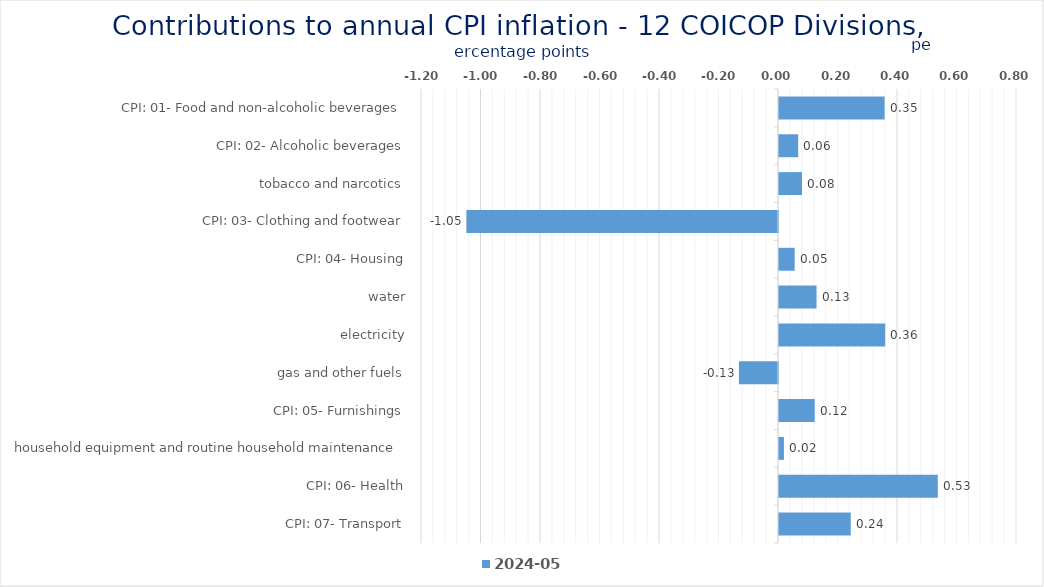
| Category | 2024-05 |
|---|---|
| CPI: 01- Food and non-alcoholic beverages | 0.355 |
| CPI: 02- Alcoholic beverages, tobacco and narcotics | 0.064 |
| CPI: 03- Clothing and footwear | 0.077 |
| CPI: 04- Housing, water, electricity, gas and other fuels | -1.047 |
| CPI: 05- Furnishings, household equipment and routine household maintenance | 0.053 |
| CPI: 06- Health | 0.126 |
| CPI: 07- Transport | 0.357 |
| CPI: 08- Communication | -0.131 |
| CPI: 09- Recreation and culture | 0.12 |
| CPI: 10- Education | 0.017 |
| CPI: 11- Restaurants and hotels | 0.534 |
| CPI: 12- Miscellaneous goods and services | 0.241 |